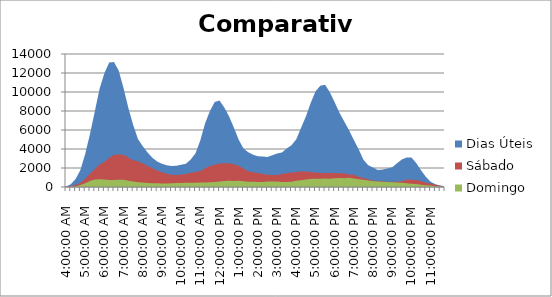
| Category | Dias Úteis | Sábado | Domingo |
|---|---|---|---|
| 0.16666666666666663 | 58.4 | 19 | 0 |
| 0.1770833333333333 | 301.4 | 115 | 18 |
| 0.18749999999999994 | 844.4 | 219 | 58 |
| 0.1979166666666666 | 1798.2 | 455 | 198 |
| 0.20833333333333326 | 3486.2 | 874 | 383 |
| 0.21874999999999992 | 5583.2 | 1394 | 630 |
| 0.22916666666666657 | 7939.6 | 1892 | 788 |
| 0.23958333333333323 | 10341 | 2357 | 826 |
| 0.2499999999999999 | 11980.2 | 2623 | 781 |
| 0.2604166666666666 | 13097.6 | 3087 | 747 |
| 0.27083333333333326 | 13155.6 | 3401 | 747 |
| 0.28124999999999994 | 12225.2 | 3418 | 764 |
| 0.29166666666666663 | 10394 | 3401 | 756 |
| 0.3020833333333333 | 8326 | 3108 | 655 |
| 0.3125 | 6531 | 2807 | 585 |
| 0.3229166666666667 | 5042 | 2721 | 509 |
| 0.33333333333333337 | 4284.6 | 2486 | 469 |
| 0.34375000000000006 | 3631.6 | 2216 | 433 |
| 0.35416666666666674 | 3073.8 | 1983 | 397 |
| 0.3645833333333334 | 2688.4 | 1727 | 383 |
| 0.3750000000000001 | 2440 | 1563 | 375 |
| 0.3854166666666668 | 2279.8 | 1389 | 379 |
| 0.3958333333333335 | 2218.4 | 1301 | 407 |
| 0.40625000000000017 | 2244.4 | 1274 | 424 |
| 0.41666666666666685 | 2343.4 | 1326 | 417 |
| 0.42708333333333354 | 2454 | 1357 | 455 |
| 0.4375000000000002 | 2883 | 1503 | 449 |
| 0.4479166666666669 | 3544.6 | 1570 | 457 |
| 0.4583333333333336 | 4928.8 | 1689 | 482 |
| 0.4687500000000003 | 6723 | 1970 | 477 |
| 0.47916666666666696 | 7994.2 | 2198 | 509 |
| 0.48958333333333365 | 8938.6 | 2353 | 533 |
| 0.5000000000000003 | 9095.2 | 2474 | 577 |
| 0.510416666666667 | 8378.2 | 2512 | 642 |
| 0.5208333333333336 | 7415.6 | 2506 | 653 |
| 0.5312500000000002 | 6237.6 | 2405 | 636 |
| 0.5416666666666669 | 4965.6 | 2236 | 648 |
| 0.5520833333333335 | 4044.8 | 1941 | 593 |
| 0.5625000000000001 | 3654 | 1666 | 553 |
| 0.5729166666666667 | 3405.4 | 1558 | 554 |
| 0.5833333333333334 | 3228.6 | 1473 | 516 |
| 0.59375 | 3215 | 1363 | 539 |
| 0.6041666666666666 | 3147.4 | 1279 | 583 |
| 0.6145833333333333 | 3340.2 | 1264 | 581 |
| 0.6249999999999999 | 3523 | 1271 | 577 |
| 0.6354166666666665 | 3634.4 | 1369 | 539 |
| 0.6458333333333331 | 4047.6 | 1451 | 532 |
| 0.6562499999999998 | 4401.8 | 1520 | 565 |
| 0.6666666666666664 | 5018.8 | 1587 | 652 |
| 0.677083333333333 | 6241.2 | 1637 | 707 |
| 0.6874999999999997 | 7424 | 1625 | 784 |
| 0.6979166666666663 | 8840 | 1587 | 845 |
| 0.7083333333333329 | 10052.4 | 1531 | 856 |
| 0.7187499999999996 | 10660.6 | 1486 | 866 |
| 0.7291666666666662 | 10761.4 | 1465 | 899 |
| 0.7395833333333328 | 9985 | 1482 | 859 |
| 0.7499999999999994 | 8933.6 | 1468 | 925 |
| 0.7604166666666661 | 7828.4 | 1454 | 958 |
| 0.7708333333333327 | 6906.6 | 1441 | 919 |
| 0.7812499999999993 | 5975.6 | 1303 | 962 |
| 0.791666666666666 | 4942.2 | 1279 | 896 |
| 0.8020833333333326 | 3974.6 | 1089 | 822 |
| 0.8124999999999992 | 2867.2 | 938 | 773 |
| 0.8229166666666659 | 2291.2 | 825 | 682 |
| 0.8333333333333325 | 2062 | 662 | 600 |
| 0.8437499999999991 | 1787.6 | 624 | 571 |
| 0.8541666666666657 | 1842.8 | 599 | 552 |
| 0.8645833333333324 | 1950.8 | 553 | 528 |
| 0.874999999999999 | 2088 | 564 | 494 |
| 0.8854166666666656 | 2495 | 577 | 484 |
| 0.8958333333333323 | 2883.2 | 612 | 458 |
| 0.9062499999999989 | 3093.6 | 777 | 402 |
| 0.9166666666666655 | 3109.2 | 774 | 350 |
| 0.9270833333333321 | 2535.8 | 727 | 319 |
| 0.9374999999999988 | 1753.6 | 642 | 225 |
| 0.9479166666666654 | 1076.2 | 459 | 181 |
| 0.958333333333332 | 556.4 | 362 | 167 |
| 0.9687499999999987 | 298.4 | 247 | 87 |
| 0.9791666666666653 | 147.2 | 134 | 50 |
| 0.9895833333333319 | 64 | 49 | 32 |